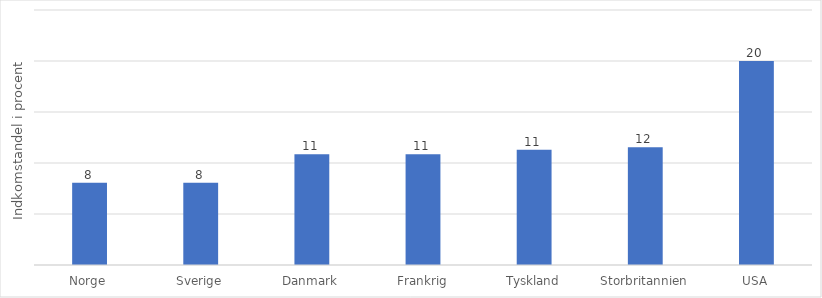
| Category | Series 0 |
|---|---|
| Norge | 8.066 |
| Sverige | 8.072 |
| Danmark | 10.856 |
| Frankrig | 10.862 |
| Tyskland | 11.288 |
| Storbritannien | 11.552 |
| USA | 19.994 |